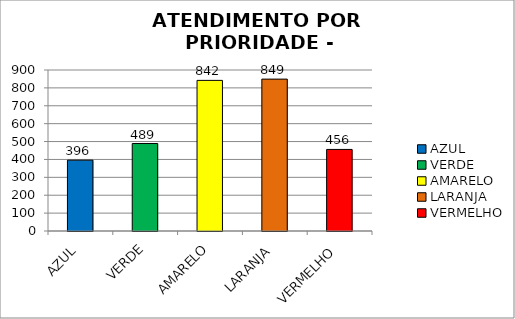
| Category | Total Regional: |
|---|---|
| AZUL | 396 |
| VERDE | 489 |
| AMARELO | 842 |
| LARANJA | 849 |
| VERMELHO | 456 |